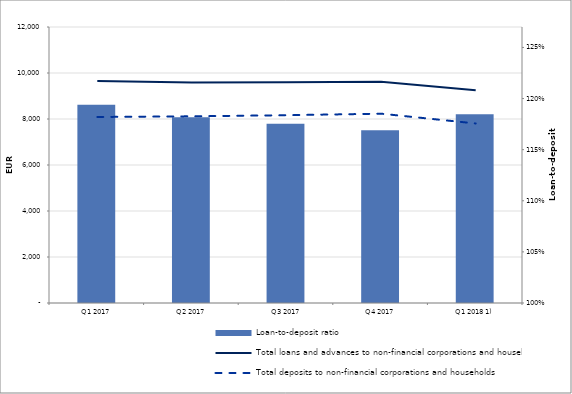
| Category | Loan-to-deposit ratio |
|---|---|
| Q1 2017 | 1.194 |
| Q2 2017 | 1.182 |
| Q3 2017 | 1.175 |
| Q4 2017 | 1.169 |
| Q1 2018 1) | 1.185 |